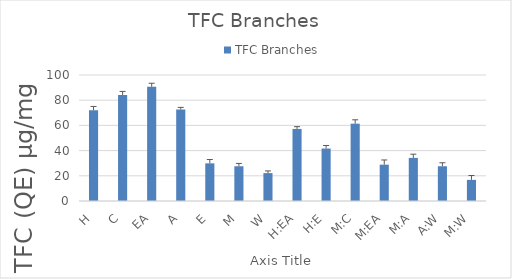
| Category | TFC Branches |
|---|---|
| H | 72.033 |
| C | 84.128 |
| EA | 90.669 |
| A | 72.576 |
| E | 29.886 |
| M | 27.565 |
| W | 22.145 |
| H:EA | 57.198 |
| H:E | 41.63 |
| M:C | 61.366 |
| M:EA | 28.824 |
| M:A | 34.193 |
| A:W | 27.583 |
| M:W | 16.762 |